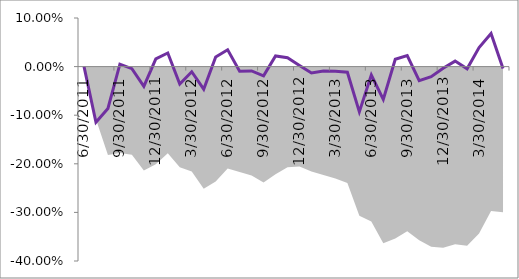
| Category | Series 1 |
|---|---|
| 0 | 0 |
| 01/01/1900 | -0.114 |
| 02/01/1900 | -0.086 |
| 03/01/1900 | 0.005 |
| 04/01/1900 | -0.004 |
| 05/01/1900 | -0.041 |
| 06/01/1900 | 0.016 |
| 07/01/1900 | 0.028 |
| 08/01/1900 | -0.036 |
| 09/01/1900 | -0.011 |
| 10/01/1900 | -0.047 |
| 11/01/1900 | 0.02 |
| 12/01/1900 | 0.035 |
| 13/01/1900 | -0.009 |
| 14/01/1900 | -0.009 |
| 15/01/1900 | -0.019 |
| 16/01/1900 | 0.022 |
| 17/01/1900 | 0.018 |
| 18/01/1900 | 0.002 |
| 19/01/1900 | -0.013 |
| 20/01/1900 | -0.009 |
| 21/01/1900 | -0.01 |
| 22/01/1900 | -0.012 |
| 23/01/1900 | -0.093 |
| 24/01/1900 | -0.017 |
| 25/01/1900 | -0.067 |
| 26/01/1900 | 0.015 |
| 27/01/1900 | 0.023 |
| 28/01/1900 | -0.029 |
| 29/01/1900 | -0.021 |
| 30/01/1900 | -0.003 |
| 31/01/1900 | 0.011 |
| 01/02/1900 | -0.005 |
| 02/02/1900 | 0.039 |
| 03/02/1900 | 0.068 |
| 04/02/1900 | -0.004 |